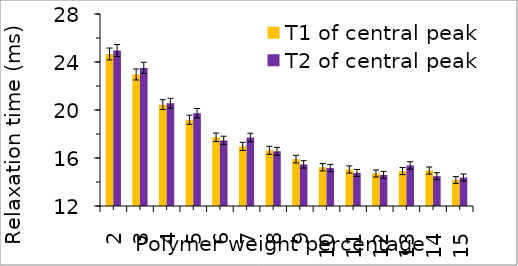
| Category | T1 of central peak | T2 of central peak |
|---|---|---|
| 2.0 | 24.667 | 24.957 |
| 3.0 | 22.96 | 23.507 |
| 4.0 | 20.447 | 20.563 |
| 5.0 | 19.187 | 19.73 |
| 6.0 | 17.725 | 17.467 |
| 7.000000000000001 | 16.969 | 17.707 |
| 8.0 | 16.64 | 16.557 |
| 9.0 | 15.906 | 15.467 |
| 10.0 | 15.232 | 15.16 |
| 11.0 | 15.042 | 14.75 |
| 12.0 | 14.71 | 14.59 |
| 13.0 | 14.912 | 15.38 |
| 14.000000000000002 | 14.952 | 14.487 |
| 15.0 | 14.167 | 14.373 |